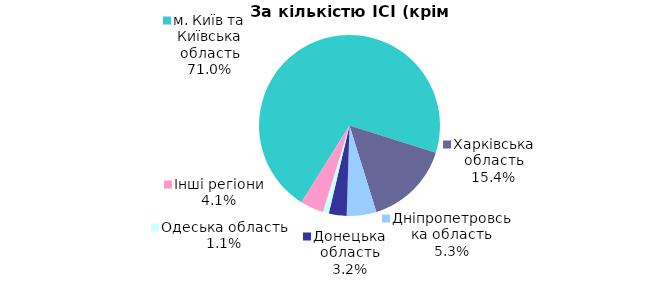
| Category | Series 0 |
|---|---|
| м. Київ та Київська область | 0.705 |
| Харківська область | 0.153 |
| Дніпропетровська область | 0.053 |
| Донецька область | 0.032 |
| Одеська область | 0.011 |
| Інші регіони | 0.041 |